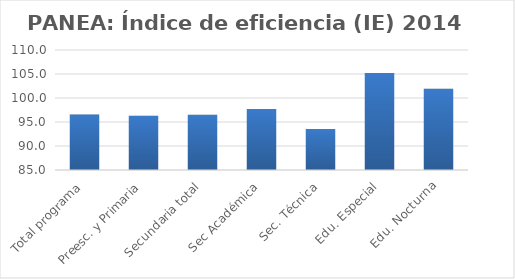
| Category | Índice de eficiencia (IE)  |
|---|---|
| Total programa | 96.56 |
| Preesc. y Primaria | 96.288 |
| Secundaria total | 96.503 |
| Sec Académica | 97.71 |
| Sec. Técnica | 93.56 |
| Edu. Especial | 105.208 |
| Edu. Nocturna | 101.918 |